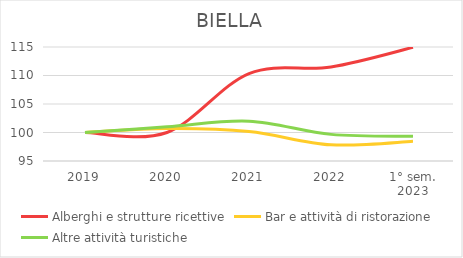
| Category | Alberghi e strutture ricettive | Bar e attività di ristorazione | Altre attività turistiche |
|---|---|---|---|
| 2019 | 100 | 100 | 100 |
| 2020 | 100 | 100.691 | 100.99 |
| 2021 | 110.345 | 100.173 | 101.98 |
| 2022 | 111.494 | 97.839 | 99.67 |
| 1° sem.
2023 | 114.943 | 98.444 | 99.34 |